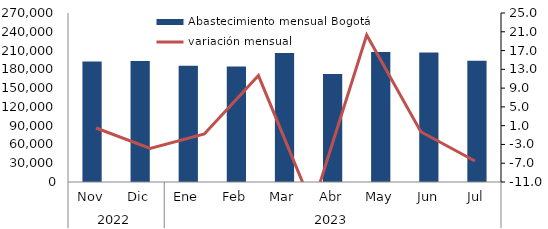
| Category | Abastecimiento mensual Bogotá |
|---|---|
| 0 | 192320 |
| 1 | 193285.843 |
| 2 | 185878.431 |
| 3 | 184433.128 |
| 4 | 205951.614 |
| 5 | 172604.503 |
| 6 | 207645.455 |
| 7 | 207031.626 |
| 8 | 193540.689 |